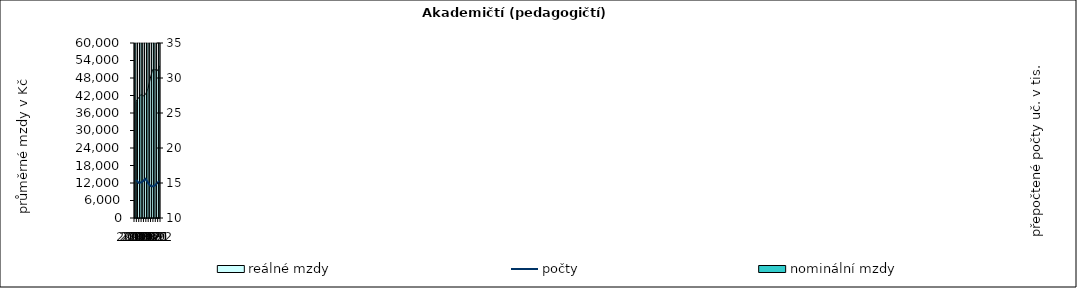
| Category | nominální mzdy |
|---|---|
| 2012.0 | 39171.217 |
| 2013.0 | 40895.462 |
| 2014.0 | 42222.526 |
| 2015.0 | 41870.772 |
| 2016.0 | 42724.98 |
| 2017.0 | 45798.448 |
| 2018.0 | 50494.723 |
| 2019.0 | 55152.774 |
| 2020.0 | 56844.089 |
| 2021.0 | 58176.81 |
| 2022.0 | 60049.48 |